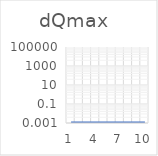
| Category | Series 0 |
|---|---|
| 0 | 4.237 |
| 1 | 2.118 |
| 2 | 0.661 |
| 3 | 0.25 |
| 4 | 0.067 |
| 5 | 0.026 |
| 6 | 0.007 |
| 7 | 0.003 |
| 8 | 0.001 |
| 9 | 0 |